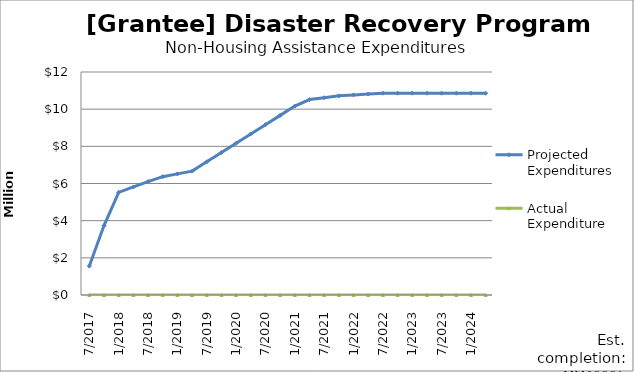
| Category | Projected Expenditures | Actual Expenditure |
|---|---|---|
| 7/2017 | 1555000 | 0 |
| 10/2017 | 3735000 | 0 |
| 1/2018 | 5525000 | 0 |
| 4/2018 | 5815000 | 0 |
| 7/2018 | 6105000 | 0 |
| 10/2018 | 6366716 | 0 |
| 1/2019 | 6516716 | 0 |
| 4/2019 | 6666716 | 0 |
| 7/2019 | 7166716 | 0 |
| 10/2019 | 7666716 | 0 |
| 1/2020 | 8166716 | 0 |
| 4/2020 | 8666716 | 0 |
| 7/2020 | 9166716 | 0 |
| 10/2020 | 9666716 | 0 |
| 1/2021 | 10166716 | 0 |
| 4/2021 | 10516716 | 0 |
| 7/2021 | 10616716 | 0 |
| 10/2021 | 10716716 | 0 |
| 1/2022 | 10766716 | 0 |
| 4/2022 | 10816716 | 0 |
| 7/2022 | 10859216 | 0 |
| 10/2022 | 10859216 | 0 |
| 1/2023 | 10859216 | 0 |
| 4/2023 | 10859216 | 0 |
| 7/2023 | 10859216 | 0 |
| 10/2023 | 10859216 | 0 |
| 1/2024 | 10859216 | 0 |
| 4/2024 | 10859216 | 0 |